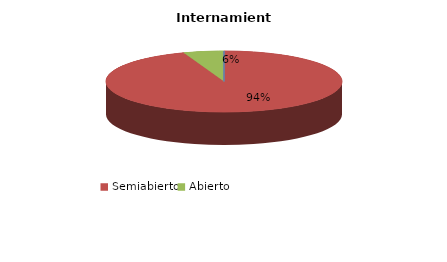
| Category | Series 0 |
|---|---|
| Cerrado | 0 |
| Semiabierto | 17 |
| Abierto | 1 |
| Terapeúticos | 0 |